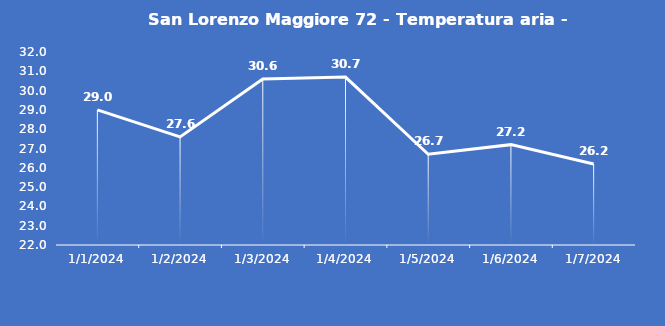
| Category | San Lorenzo Maggiore 72 - Temperatura aria - Grezzo (°C) |
|---|---|
| 1/1/24 | 29 |
| 1/2/24 | 27.6 |
| 1/3/24 | 30.6 |
| 1/4/24 | 30.7 |
| 1/5/24 | 26.7 |
| 1/6/24 | 27.2 |
| 1/7/24 | 26.2 |